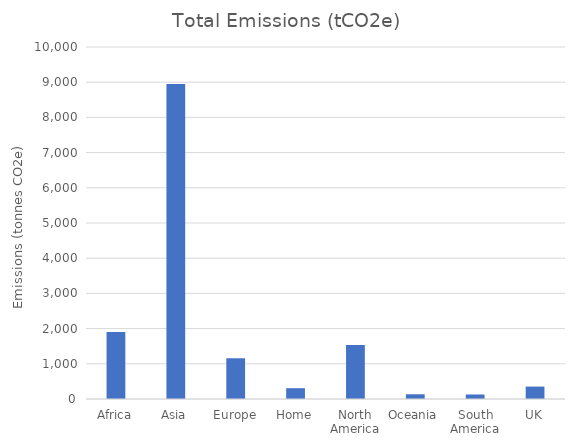
| Category | Total Emissions (tCO2e) |
|---|---|
| Africa | 1900.581 |
| Asia | 8947.654 |
| Europe | 1157.171 |
| Home | 307.014 |
| North America | 1536.909 |
| Oceania | 134.687 |
| South America | 128.373 |
| UK | 352.294 |